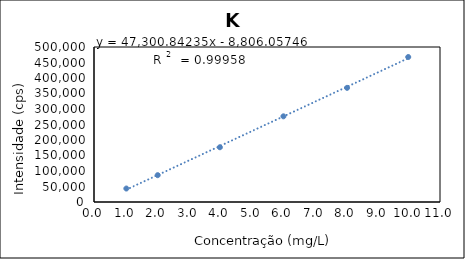
| Category | Series 0 |
|---|---|
| 1.0283695365206507 | 43463.69 |
| 2.024772641888375 | 86519.59 |
| 4.002237987752722 | 176614.89 |
| 6.022451210623383 | 276370.89 |
| 8.04601597773645 | 368235.89 |
| 9.990042202707437 | 467671.89 |